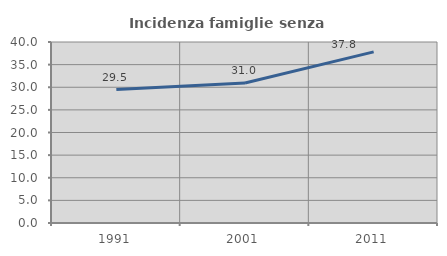
| Category | Incidenza famiglie senza nuclei |
|---|---|
| 1991.0 | 29.487 |
| 2001.0 | 30.952 |
| 2011.0 | 37.809 |